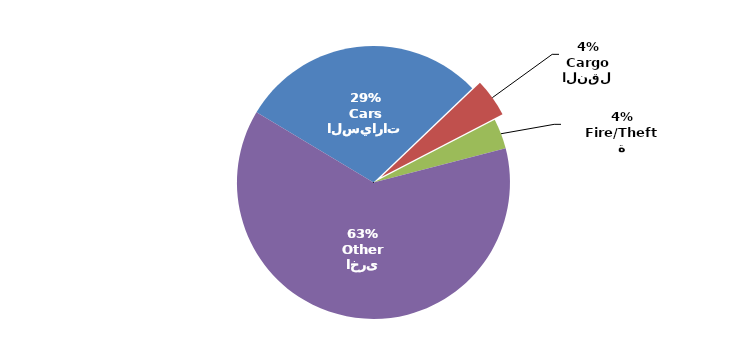
| Category | Series 0 |
|---|---|
| السيارات
Cars | 626956 |
| النقل
Cargo | 97203 |
| الحريق/السرقة
Fire/Theft | 76540 |
| اخرى
Other | 1342480 |